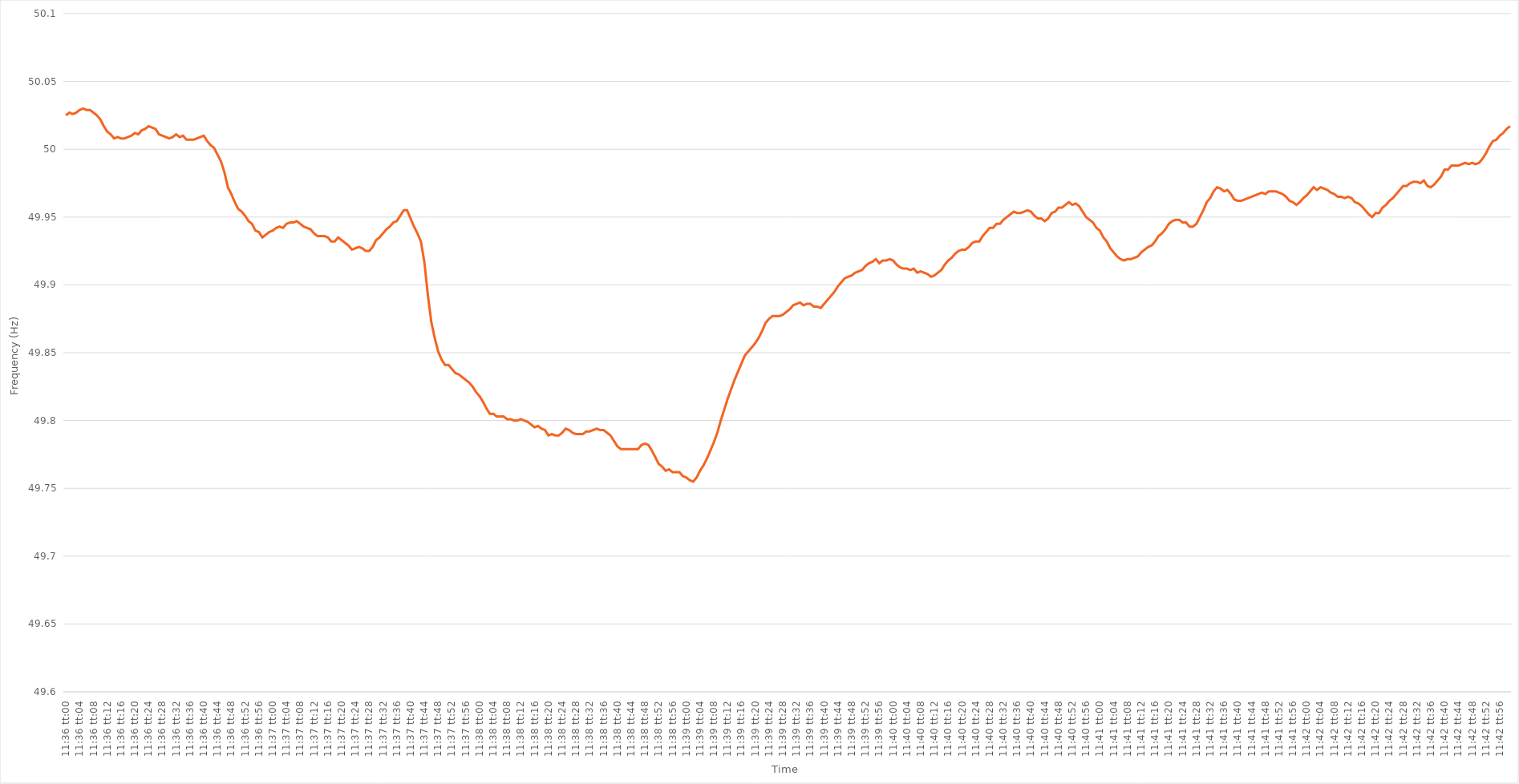
| Category | Series 0 |
|---|---|
| 0.48333333333333334 | 50.025 |
| 0.48334490740740743 | 50.027 |
| 0.48335648148148147 | 50.026 |
| 0.48336805555555556 | 50.027 |
| 0.4833796296296296 | 50.029 |
| 0.48339120370370375 | 50.03 |
| 0.4834027777777778 | 50.029 |
| 0.4834143518518519 | 50.029 |
| 0.4834259259259259 | 50.027 |
| 0.48343749999999996 | 50.025 |
| 0.48344907407407406 | 50.022 |
| 0.4834606481481481 | 50.017 |
| 0.48347222222222225 | 50.013 |
| 0.4834837962962963 | 50.011 |
| 0.4834953703703704 | 50.008 |
| 0.4835069444444444 | 50.009 |
| 0.4835185185185185 | 50.008 |
| 0.48353009259259255 | 50.008 |
| 0.4835416666666667 | 50.009 |
| 0.48355324074074074 | 50.01 |
| 0.48356481481481484 | 50.012 |
| 0.4835763888888889 | 50.011 |
| 0.48358796296296297 | 50.014 |
| 0.483599537037037 | 50.015 |
| 0.48361111111111116 | 50.017 |
| 0.4836226851851852 | 50.016 |
| 0.4836342592592593 | 50.015 |
| 0.48364583333333333 | 50.011 |
| 0.4836574074074074 | 50.01 |
| 0.48366898148148146 | 50.009 |
| 0.4836805555555555 | 50.008 |
| 0.48369212962962965 | 50.009 |
| 0.4837037037037037 | 50.011 |
| 0.4837152777777778 | 50.009 |
| 0.4837268518518518 | 50.01 |
| 0.4837384259259259 | 50.007 |
| 0.48374999999999996 | 50.007 |
| 0.4837615740740741 | 50.007 |
| 0.48377314814814815 | 50.008 |
| 0.48378472222222224 | 50.009 |
| 0.4837962962962963 | 50.01 |
| 0.4838078703703704 | 50.006 |
| 0.4838194444444444 | 50.003 |
| 0.48383101851851856 | 50.001 |
| 0.4838425925925926 | 49.996 |
| 0.4838541666666667 | 49.991 |
| 0.48386574074074074 | 49.983 |
| 0.48387731481481483 | 49.972 |
| 0.48388888888888887 | 49.967 |
| 0.483900462962963 | 49.961 |
| 0.48391203703703706 | 49.956 |
| 0.4839236111111111 | 49.954 |
| 0.4839351851851852 | 49.951 |
| 0.48394675925925923 | 49.947 |
| 0.4839583333333333 | 49.945 |
| 0.48396990740740736 | 49.94 |
| 0.4839814814814815 | 49.939 |
| 0.48399305555555555 | 49.935 |
| 0.48400462962962965 | 49.937 |
| 0.4840162037037037 | 49.939 |
| 0.4840277777777778 | 49.94 |
| 0.4840393518518518 | 49.942 |
| 0.48405092592592597 | 49.943 |
| 0.4840625 | 49.942 |
| 0.4840740740740741 | 49.945 |
| 0.48408564814814814 | 49.946 |
| 0.48409722222222223 | 49.946 |
| 0.4841087962962963 | 49.947 |
| 0.4841203703703704 | 49.945 |
| 0.48413194444444446 | 49.943 |
| 0.4841435185185185 | 49.942 |
| 0.4841550925925926 | 49.941 |
| 0.48416666666666663 | 49.938 |
| 0.48417824074074073 | 49.936 |
| 0.48418981481481477 | 49.936 |
| 0.4842013888888889 | 49.936 |
| 0.48421296296296296 | 49.935 |
| 0.48422453703703705 | 49.932 |
| 0.4842361111111111 | 49.932 |
| 0.4842476851851852 | 49.935 |
| 0.4842592592592592 | 49.933 |
| 0.4842708333333334 | 49.931 |
| 0.4842824074074074 | 49.929 |
| 0.4842939814814815 | 49.926 |
| 0.48430555555555554 | 49.927 |
| 0.48431712962962964 | 49.928 |
| 0.4843287037037037 | 49.927 |
| 0.48434027777777783 | 49.925 |
| 0.48435185185185187 | 49.925 |
| 0.48436342592592596 | 49.928 |
| 0.484375 | 49.933 |
| 0.48438657407407404 | 49.935 |
| 0.48439814814814813 | 49.938 |
| 0.48440972222222217 | 49.941 |
| 0.4844212962962963 | 49.943 |
| 0.48443287037037036 | 49.946 |
| 0.48444444444444446 | 49.947 |
| 0.4844560185185185 | 49.951 |
| 0.4844675925925926 | 49.955 |
| 0.4844791666666666 | 49.955 |
| 0.4844907407407408 | 49.949 |
| 0.4845023148148148 | 49.943 |
| 0.4845138888888889 | 49.938 |
| 0.48452546296296295 | 49.932 |
| 0.48453703703703704 | 49.917 |
| 0.4845486111111111 | 49.893 |
| 0.48456018518518523 | 49.873 |
| 0.48457175925925927 | 49.861 |
| 0.48458333333333337 | 49.851 |
| 0.4845949074074074 | 49.845 |
| 0.4846064814814815 | 49.841 |
| 0.48461805555555554 | 49.841 |
| 0.4846296296296296 | 49.838 |
| 0.4846412037037037 | 49.835 |
| 0.48465277777777777 | 49.834 |
| 0.48466435185185186 | 49.832 |
| 0.4846759259259259 | 49.83 |
| 0.4846875 | 49.828 |
| 0.48469907407407403 | 49.825 |
| 0.4847106481481482 | 49.821 |
| 0.4847222222222222 | 49.818 |
| 0.4847337962962963 | 49.814 |
| 0.48474537037037035 | 49.809 |
| 0.48475694444444445 | 49.805 |
| 0.4847685185185185 | 49.805 |
| 0.48478009259259264 | 49.803 |
| 0.4847916666666667 | 49.803 |
| 0.48480324074074077 | 49.803 |
| 0.4848148148148148 | 49.801 |
| 0.4848263888888889 | 49.801 |
| 0.48483796296296294 | 49.8 |
| 0.484849537037037 | 49.8 |
| 0.48486111111111113 | 49.801 |
| 0.48487268518518517 | 49.8 |
| 0.48488425925925926 | 49.799 |
| 0.4848958333333333 | 49.797 |
| 0.4849074074074074 | 49.795 |
| 0.48491898148148144 | 49.796 |
| 0.4849305555555556 | 49.794 |
| 0.4849421296296296 | 49.793 |
| 0.4849537037037037 | 49.789 |
| 0.48496527777777776 | 49.79 |
| 0.48497685185185185 | 49.789 |
| 0.4849884259259259 | 49.789 |
| 0.48500000000000004 | 49.791 |
| 0.4850115740740741 | 49.794 |
| 0.4850231481481482 | 49.793 |
| 0.4850347222222222 | 49.791 |
| 0.4850462962962963 | 49.79 |
| 0.48505787037037035 | 49.79 |
| 0.4850694444444445 | 49.79 |
| 0.48508101851851854 | 49.792 |
| 0.4850925925925926 | 49.792 |
| 0.48510416666666667 | 49.793 |
| 0.4851157407407407 | 49.794 |
| 0.4851273148148148 | 49.793 |
| 0.48513888888888884 | 49.793 |
| 0.485150462962963 | 49.791 |
| 0.48516203703703703 | 49.789 |
| 0.4851736111111111 | 49.785 |
| 0.48518518518518516 | 49.781 |
| 0.48519675925925926 | 49.779 |
| 0.4852083333333333 | 49.779 |
| 0.48521990740740745 | 49.779 |
| 0.4852314814814815 | 49.779 |
| 0.4852430555555556 | 49.779 |
| 0.4852546296296296 | 49.779 |
| 0.4852662037037037 | 49.782 |
| 0.48527777777777775 | 49.783 |
| 0.4852893518518519 | 49.782 |
| 0.48530092592592594 | 49.778 |
| 0.48531250000000004 | 49.773 |
| 0.4853240740740741 | 49.768 |
| 0.4853356481481481 | 49.766 |
| 0.4853472222222222 | 49.763 |
| 0.48535879629629625 | 49.764 |
| 0.4853703703703704 | 49.762 |
| 0.48538194444444444 | 49.762 |
| 0.48539351851851853 | 49.762 |
| 0.48540509259259257 | 49.759 |
| 0.48541666666666666 | 49.758 |
| 0.4854282407407407 | 49.756 |
| 0.48543981481481485 | 49.755 |
| 0.4854513888888889 | 49.758 |
| 0.485462962962963 | 49.763 |
| 0.485474537037037 | 49.767 |
| 0.4854861111111111 | 49.772 |
| 0.48549768518518516 | 49.778 |
| 0.4855092592592593 | 49.784 |
| 0.48552083333333335 | 49.791 |
| 0.48553240740740744 | 49.8 |
| 0.4855439814814815 | 49.808 |
| 0.4855555555555556 | 49.816 |
| 0.4855671296296296 | 49.823 |
| 0.48557870370370365 | 49.83 |
| 0.4855902777777778 | 49.836 |
| 0.48560185185185184 | 49.842 |
| 0.48561342592592593 | 49.848 |
| 0.485625 | 49.851 |
| 0.48563657407407407 | 49.854 |
| 0.4856481481481481 | 49.857 |
| 0.48565972222222226 | 49.861 |
| 0.4856712962962963 | 49.866 |
| 0.4856828703703704 | 49.872 |
| 0.48569444444444443 | 49.875 |
| 0.4857060185185185 | 49.877 |
| 0.48571759259259256 | 49.877 |
| 0.4857291666666667 | 49.877 |
| 0.48574074074074075 | 49.878 |
| 0.48575231481481485 | 49.88 |
| 0.4857638888888889 | 49.882 |
| 0.485775462962963 | 49.885 |
| 0.485787037037037 | 49.886 |
| 0.48579861111111106 | 49.887 |
| 0.4858101851851852 | 49.885 |
| 0.48582175925925924 | 49.886 |
| 0.48583333333333334 | 49.886 |
| 0.4858449074074074 | 49.884 |
| 0.4858564814814815 | 49.884 |
| 0.4858680555555555 | 49.883 |
| 0.48587962962962966 | 49.886 |
| 0.4858912037037037 | 49.889 |
| 0.4859027777777778 | 49.892 |
| 0.48591435185185183 | 49.895 |
| 0.48592592592592593 | 49.899 |
| 0.48593749999999997 | 49.902 |
| 0.4859490740740741 | 49.905 |
| 0.48596064814814816 | 49.906 |
| 0.48597222222222225 | 49.907 |
| 0.4859837962962963 | 49.909 |
| 0.4859953703703704 | 49.91 |
| 0.4860069444444444 | 49.911 |
| 0.48601851851851857 | 49.914 |
| 0.4860300925925926 | 49.916 |
| 0.48604166666666665 | 49.917 |
| 0.48605324074074074 | 49.919 |
| 0.4860648148148148 | 49.916 |
| 0.4860763888888889 | 49.918 |
| 0.4860879629629629 | 49.918 |
| 0.48609953703703707 | 49.919 |
| 0.4861111111111111 | 49.918 |
| 0.4861226851851852 | 49.915 |
| 0.48613425925925924 | 49.913 |
| 0.48614583333333333 | 49.912 |
| 0.48615740740740737 | 49.912 |
| 0.4861689814814815 | 49.911 |
| 0.48618055555555556 | 49.912 |
| 0.48619212962962965 | 49.909 |
| 0.4862037037037037 | 49.91 |
| 0.4862152777777778 | 49.909 |
| 0.4862268518518518 | 49.908 |
| 0.486238425925926 | 49.906 |
| 0.48625 | 49.907 |
| 0.4862615740740741 | 49.909 |
| 0.48627314814814815 | 49.911 |
| 0.4862847222222222 | 49.915 |
| 0.4862962962962963 | 49.918 |
| 0.4863078703703703 | 49.92 |
| 0.48631944444444447 | 49.923 |
| 0.4863310185185185 | 49.925 |
| 0.4863425925925926 | 49.926 |
| 0.48635416666666664 | 49.926 |
| 0.48636574074074074 | 49.928 |
| 0.4863773148148148 | 49.931 |
| 0.4863888888888889 | 49.932 |
| 0.48640046296296297 | 49.932 |
| 0.48641203703703706 | 49.936 |
| 0.4864236111111111 | 49.939 |
| 0.4864351851851852 | 49.942 |
| 0.48644675925925923 | 49.942 |
| 0.4864583333333334 | 49.945 |
| 0.4864699074074074 | 49.945 |
| 0.4864814814814815 | 49.948 |
| 0.48649305555555555 | 49.95 |
| 0.48650462962962965 | 49.952 |
| 0.4865162037037037 | 49.954 |
| 0.4865277777777777 | 49.953 |
| 0.4865393518518519 | 49.953 |
| 0.4865509259259259 | 49.954 |
| 0.4865625 | 49.955 |
| 0.48657407407407405 | 49.954 |
| 0.48658564814814814 | 49.951 |
| 0.4865972222222222 | 49.949 |
| 0.48660879629629633 | 49.949 |
| 0.48662037037037037 | 49.947 |
| 0.48663194444444446 | 49.949 |
| 0.4866435185185185 | 49.953 |
| 0.4866550925925926 | 49.954 |
| 0.48666666666666664 | 49.957 |
| 0.4866782407407408 | 49.957 |
| 0.4866898148148148 | 49.959 |
| 0.4867013888888889 | 49.961 |
| 0.48671296296296296 | 49.959 |
| 0.48672453703703705 | 49.96 |
| 0.4867361111111111 | 49.958 |
| 0.48674768518518513 | 49.954 |
| 0.4867592592592593 | 49.95 |
| 0.4867708333333333 | 49.948 |
| 0.4867824074074074 | 49.946 |
| 0.48679398148148145 | 49.942 |
| 0.48680555555555555 | 49.94 |
| 0.4868171296296296 | 49.935 |
| 0.48682870370370374 | 49.932 |
| 0.4868402777777778 | 49.927 |
| 0.48685185185185187 | 49.924 |
| 0.4868634259259259 | 49.921 |
| 0.486875 | 49.919 |
| 0.48688657407407404 | 49.918 |
| 0.4868981481481482 | 49.919 |
| 0.48690972222222223 | 49.919 |
| 0.4869212962962963 | 49.92 |
| 0.48693287037037036 | 49.921 |
| 0.48694444444444446 | 49.924 |
| 0.4869560185185185 | 49.926 |
| 0.48696759259259265 | 49.928 |
| 0.4869791666666667 | 49.929 |
| 0.4869907407407407 | 49.932 |
| 0.4870023148148148 | 49.936 |
| 0.48701388888888886 | 49.938 |
| 0.48702546296296295 | 49.941 |
| 0.487037037037037 | 49.945 |
| 0.48704861111111114 | 49.947 |
| 0.4870601851851852 | 49.948 |
| 0.4870717592592593 | 49.948 |
| 0.4870833333333333 | 49.946 |
| 0.4870949074074074 | 49.946 |
| 0.48710648148148145 | 49.943 |
| 0.4871180555555556 | 49.943 |
| 0.48712962962962963 | 49.945 |
| 0.48714120370370373 | 49.95 |
| 0.48715277777777777 | 49.955 |
| 0.48716435185185186 | 49.961 |
| 0.4871759259259259 | 49.964 |
| 0.48718750000000005 | 49.969 |
| 0.4871990740740741 | 49.972 |
| 0.4872106481481482 | 49.971 |
| 0.4872222222222222 | 49.969 |
| 0.48723379629629626 | 49.97 |
| 0.48724537037037036 | 49.967 |
| 0.4872569444444444 | 49.963 |
| 0.48726851851851855 | 49.962 |
| 0.4872800925925926 | 49.962 |
| 0.4872916666666667 | 49.963 |
| 0.4873032407407407 | 49.964 |
| 0.4873148148148148 | 49.965 |
| 0.48732638888888885 | 49.966 |
| 0.487337962962963 | 49.967 |
| 0.48734953703703704 | 49.968 |
| 0.48736111111111113 | 49.967 |
| 0.4873726851851852 | 49.969 |
| 0.48738425925925927 | 49.969 |
| 0.4873958333333333 | 49.969 |
| 0.48740740740740746 | 49.968 |
| 0.4874189814814815 | 49.967 |
| 0.4874305555555556 | 49.965 |
| 0.48744212962962963 | 49.962 |
| 0.48745370370370367 | 49.961 |
| 0.48746527777777776 | 49.959 |
| 0.4874768518518518 | 49.961 |
| 0.48748842592592595 | 49.964 |
| 0.4875 | 49.966 |
| 0.4875115740740741 | 49.969 |
| 0.4875231481481481 | 49.972 |
| 0.4875347222222222 | 49.97 |
| 0.48754629629629626 | 49.972 |
| 0.4875578703703704 | 49.971 |
| 0.48756944444444444 | 49.97 |
| 0.48758101851851854 | 49.968 |
| 0.4875925925925926 | 49.967 |
| 0.48760416666666667 | 49.965 |
| 0.4876157407407407 | 49.965 |
| 0.48762731481481486 | 49.964 |
| 0.4876388888888889 | 49.965 |
| 0.487650462962963 | 49.964 |
| 0.48766203703703703 | 49.961 |
| 0.4876736111111111 | 49.96 |
| 0.48768518518518517 | 49.958 |
| 0.4876967592592592 | 49.955 |
| 0.48770833333333335 | 49.952 |
| 0.4877199074074074 | 49.95 |
| 0.4877314814814815 | 49.953 |
| 0.4877430555555555 | 49.953 |
| 0.4877546296296296 | 49.957 |
| 0.48776620370370366 | 49.959 |
| 0.4877777777777778 | 49.962 |
| 0.48778935185185185 | 49.964 |
| 0.48780092592592594 | 49.967 |
| 0.4878125 | 49.97 |
| 0.4878240740740741 | 49.973 |
| 0.4878356481481481 | 49.973 |
| 0.48784722222222227 | 49.975 |
| 0.4878587962962963 | 49.976 |
| 0.4878703703703704 | 49.976 |
| 0.48788194444444444 | 49.975 |
| 0.48789351851851853 | 49.977 |
| 0.48790509259259257 | 49.973 |
| 0.4879166666666667 | 49.972 |
| 0.48792824074074076 | 49.974 |
| 0.4879398148148148 | 49.977 |
| 0.4879513888888889 | 49.98 |
| 0.48796296296296293 | 49.985 |
| 0.487974537037037 | 49.985 |
| 0.48798611111111106 | 49.988 |
| 0.4879976851851852 | 49.988 |
| 0.48800925925925925 | 49.988 |
| 0.48802083333333335 | 49.989 |
| 0.4880324074074074 | 49.99 |
| 0.4880439814814815 | 49.989 |
| 0.4880555555555555 | 49.99 |
| 0.48806712962962967 | 49.989 |
| 0.4880787037037037 | 49.99 |
| 0.4880902777777778 | 49.993 |
| 0.48810185185185184 | 49.997 |
| 0.48811342592592594 | 50.002 |
| 0.488125 | 50.006 |
| 0.4881365740740741 | 50.007 |
| 0.48814814814814816 | 50.01 |
| 0.48815972222222226 | 50.012 |
| 0.4881712962962963 | 50.015 |
| 0.48818287037037034 | 50.017 |